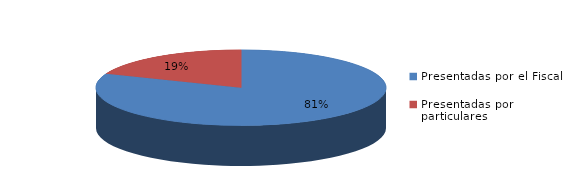
| Category | Series 0 |
|---|---|
| Presentadas por el Fiscal | 141 |
| Presentadas por particulares | 33 |